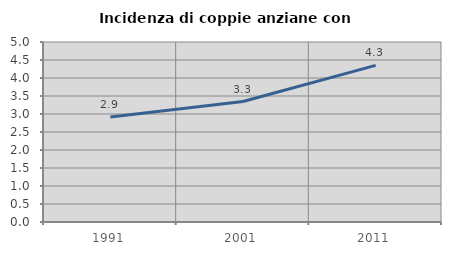
| Category | Incidenza di coppie anziane con figli |
|---|---|
| 1991.0 | 2.92 |
| 2001.0 | 3.347 |
| 2011.0 | 4.349 |